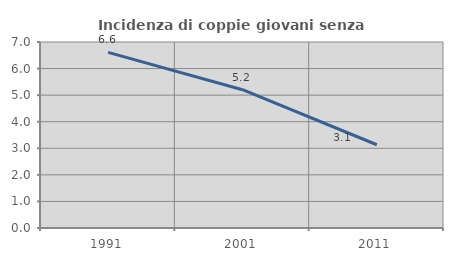
| Category | Incidenza di coppie giovani senza figli |
|---|---|
| 1991.0 | 6.608 |
| 2001.0 | 5.204 |
| 2011.0 | 3.133 |